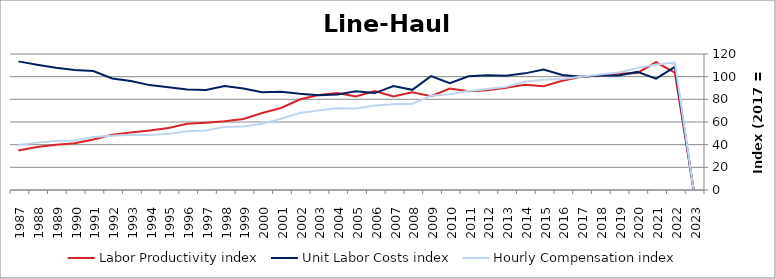
| Category | Labor Productivity index | Unit Labor Costs index | Hourly Compensation index |
|---|---|---|---|
| 2023.0 | 0 | 0 | 0 |
| 2022.0 | 103.509 | 108.64 | 112.453 |
| 2021.0 | 112.71 | 98.255 | 110.743 |
| 2020.0 | 103.307 | 104.201 | 107.646 |
| 2019.0 | 102.606 | 100.97 | 103.602 |
| 2018.0 | 101.038 | 100.932 | 101.98 |
| 2017.0 | 100 | 100 | 100 |
| 2016.0 | 96.442 | 101.52 | 97.907 |
| 2015.0 | 91.529 | 106.289 | 97.285 |
| 2014.0 | 92.902 | 102.918 | 95.612 |
| 2013.0 | 90.316 | 100.738 | 90.983 |
| 2012.0 | 88.002 | 101.277 | 89.126 |
| 2011.0 | 87.044 | 100.353 | 87.352 |
| 2010.0 | 89.513 | 94.316 | 84.425 |
| 2009.0 | 82.802 | 100.433 | 83.16 |
| 2008.0 | 86.172 | 88.372 | 76.151 |
| 2007.0 | 82.498 | 91.656 | 75.614 |
| 2006.0 | 87.299 | 85.509 | 74.648 |
| 2005.0 | 82.524 | 87.201 | 71.962 |
| 2004.0 | 85.638 | 84.319 | 72.208 |
| 2003.0 | 83.846 | 83.56 | 70.061 |
| 2002.0 | 79.884 | 84.947 | 67.859 |
| 2001.0 | 72.36 | 86.788 | 62.8 |
| 2000.0 | 67.88 | 86.159 | 58.485 |
| 1999.0 | 62.665 | 89.574 | 56.131 |
| 1998.0 | 60.651 | 91.826 | 55.694 |
| 1997.0 | 59.399 | 88.325 | 52.464 |
| 1996.0 | 58.432 | 88.65 | 51.8 |
| 1995.0 | 54.657 | 90.665 | 49.554 |
| 1994.0 | 52.535 | 92.543 | 48.617 |
| 1993.0 | 50.739 | 96.261 | 48.842 |
| 1992.0 | 48.709 | 98.411 | 47.934 |
| 1991.0 | 44.588 | 104.909 | 46.777 |
| 1990.0 | 41.351 | 105.809 | 43.753 |
| 1989.0 | 40.006 | 107.824 | 43.136 |
| 1988.0 | 37.844 | 110.449 | 41.799 |
| 1987.0 | 34.911 | 113.503 | 39.625 |